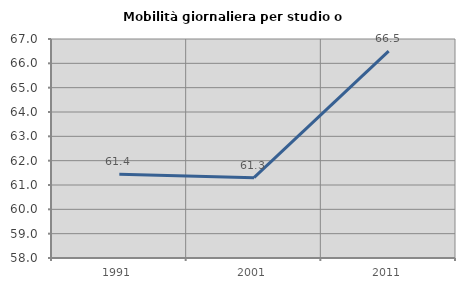
| Category | Mobilità giornaliera per studio o lavoro |
|---|---|
| 1991.0 | 61.437 |
| 2001.0 | 61.3 |
| 2011.0 | 66.501 |